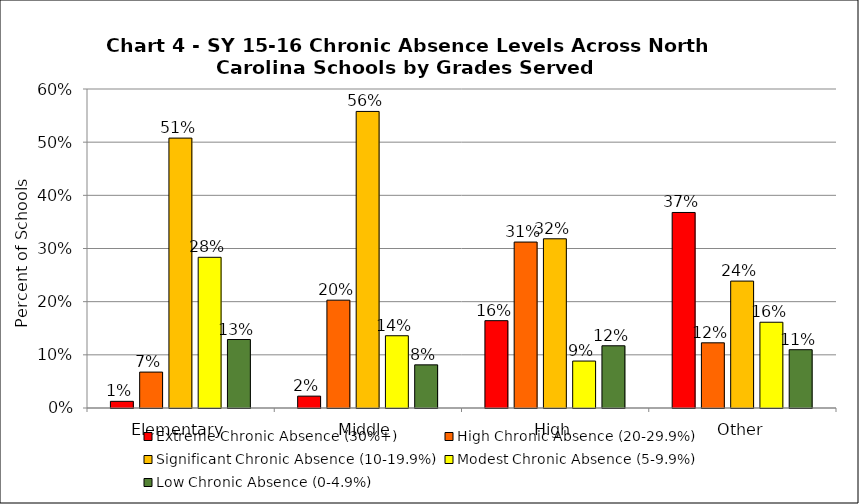
| Category | Extreme Chronic Absence (30%+) | High Chronic Absence (20-29.9%) | Significant Chronic Absence (10-19.9%) | Modest Chronic Absence (5-9.9%) | Low Chronic Absence (0-4.9%) |
|---|---|---|---|---|---|
| 0 | 0.013 | 0.068 | 0.508 | 0.283 | 0.129 |
| 1 | 0.022 | 0.203 | 0.558 | 0.136 | 0.081 |
| 2 | 0.164 | 0.312 | 0.318 | 0.088 | 0.117 |
| 3 | 0.368 | 0.123 | 0.239 | 0.161 | 0.11 |